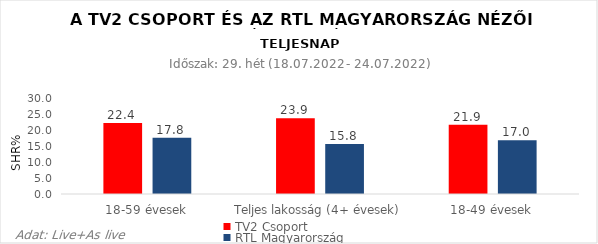
| Category | TV2 Csoport | RTL Magyarország |
|---|---|---|
| 18-59 évesek | 22.4 | 17.8 |
| Teljes lakosság (4+ évesek) | 23.9 | 15.8 |
| 18-49 évesek | 21.9 | 17 |